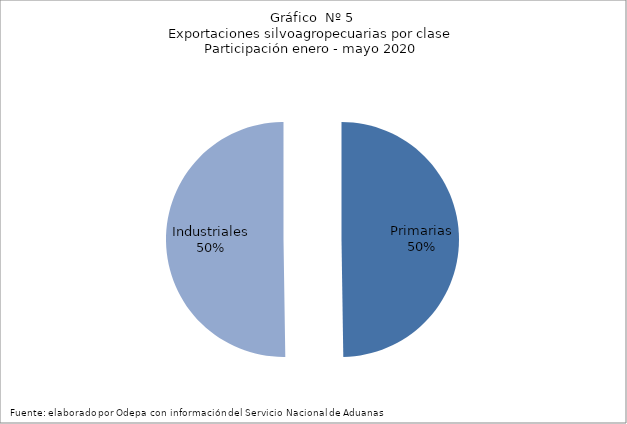
| Category | Series 0 |
|---|---|
| Primarias | 3569246 |
| Industriales | 3604371 |